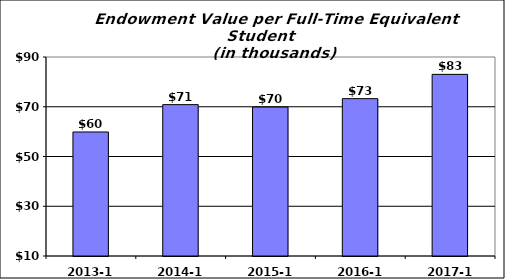
| Category | Value ($000) |
|---|---|
| 2013-14 | 59.861 |
| 2014-15 | 70.853 |
| 2015-16 | 69.875 |
| 2016-17 | 73.258 |
| 2017-18 | 83.02 |